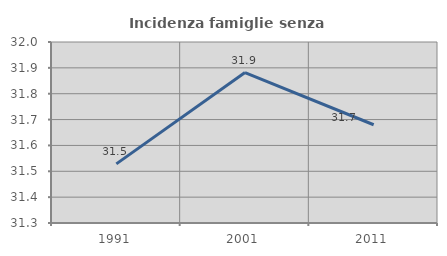
| Category | Incidenza famiglie senza nuclei |
|---|---|
| 1991.0 | 31.529 |
| 2001.0 | 31.882 |
| 2011.0 | 31.68 |